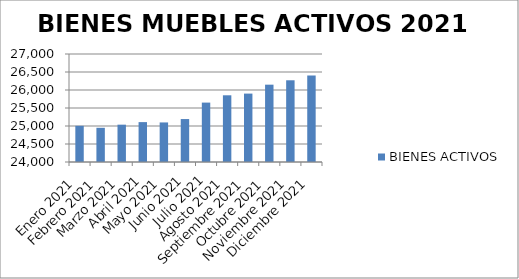
| Category | BIENES ACTIVOS |
|---|---|
| Enero 2021 | 25005 |
| Febrero 2021 | 24950 |
| Marzo 2021 | 25037 |
| Abril 2021 | 25108 |
| Mayo 2021 | 25099 |
| Junio 2021 | 25193 |
| Julio 2021 | 25650 |
| Agosto 2021 | 25853 |
| Septiembre 2021 | 25900 |
| Octubre 2021 | 26148 |
| Noviembre 2021 | 26270 |
| Diciembre 2021 | 26401 |